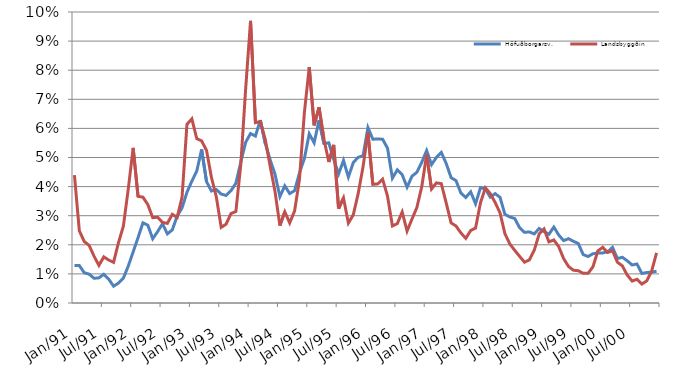
| Category | Höfuðborgarsv. | Landsbyggðin |
|---|---|---|
| 1991-01-01 | 1.291 | 4.392 |
| 1991-02-01 | 1.287 | 2.476 |
| 1991-03-01 | 1.041 | 2.116 |
| 1991-04-01 | 0.991 | 1.979 |
| 1991-05-01 | 0.85 | 1.608 |
| 1991-06-01 | 0.864 | 1.295 |
| 1991-07-01 | 0.989 | 1.583 |
| 1991-08-01 | 0.82 | 1.476 |
| 1991-09-01 | 0.577 | 1.394 |
| 1991-10-01 | 0.683 | 2.071 |
| 1991-11-01 | 0.855 | 2.641 |
| 1991-12-01 | 1.266 | 3.913 |
| 1992-01-01 | 1.756 | 5.33 |
| 1992-02-01 | 2.245 | 3.666 |
| 1992-03-01 | 2.755 | 3.638 |
| 1992-04-01 | 2.675 | 3.384 |
| 1992-05-01 | 2.208 | 2.933 |
| 1992-06-01 | 2.452 | 2.948 |
| 1992-07-01 | 2.724 | 2.768 |
| 1992-08-01 | 2.375 | 2.737 |
| 1992-09-01 | 2.512 | 3.047 |
| 1992-10-01 | 2.987 | 2.943 |
| 1992-11-01 | 3.271 | 3.641 |
| 1992-12-01 | 3.804 | 6.14 |
| 1993-01-01 | 4.187 | 6.329 |
| 1993-02-01 | 4.532 | 5.649 |
| 1993-03-01 | 5.278 | 5.572 |
| 1993-04-01 | 4.171 | 5.245 |
| 1993-05-01 | 3.849 | 4.319 |
| 1993-06-01 | 3.898 | 3.65 |
| 1993-07-01 | 3.743 | 2.599 |
| 1993-08-01 | 3.697 | 2.71 |
| 1993-09-01 | 3.86 | 3.074 |
| 1993-10-01 | 4.113 | 3.143 |
| 1993-11-01 | 4.836 | 4.743 |
| 1993-12-01 | 5.521 | 7.357 |
| 1994-01-01 | 5.823 | 9.697 |
| 1994-02-01 | 5.739 | 6.198 |
| 1994-03-01 | 6.284 | 6.237 |
| 1994-04-01 | 5.492 | 5.627 |
| 1994-05-01 | 4.928 | 4.708 |
| 1994-06-01 | 4.426 | 3.829 |
| 1994-07-01 | 3.657 | 2.659 |
| 1994-08-01 | 4.025 | 3.136 |
| 1994-09-01 | 3.762 | 2.751 |
| 1994-10-01 | 3.859 | 3.158 |
| 1994-11-01 | 4.467 | 4.248 |
| 1994-12-01 | 4.965 | 6.537 |
| 1995-01-01 | 5.814 | 8.106 |
| 1995-02-01 | 5.506 | 6.106 |
| 1995-03-01 | 6.281 | 6.725 |
| 1995-04-01 | 5.483 | 5.638 |
| 1995-05-01 | 5.504 | 4.843 |
| 1995-06-01 | 4.939 | 5.433 |
| 1995-07-01 | 4.434 | 3.24 |
| 1995-08-01 | 4.899 | 3.609 |
| 1995-09-01 | 4.327 | 2.746 |
| 1995-10-01 | 4.827 | 3.03 |
| 1995-11-01 | 5.007 | 3.757 |
| 1995-12-01 | 5.059 | 4.678 |
| 1996-01-01 | 6.027 | 5.854 |
| 1996-02-01 | 5.628 | 4.077 |
| 1996-03-01 | 5.638 | 4.093 |
| 1996-04-01 | 5.627 | 4.254 |
| 1996-05-01 | 5.321 | 3.672 |
| 1996-06-01 | 4.289 | 2.647 |
| 1996-07-01 | 4.574 | 2.727 |
| 1996-08-01 | 4.406 | 3.127 |
| 1996-09-01 | 3.981 | 2.471 |
| 1996-10-01 | 4.357 | 2.884 |
| 1996-11-01 | 4.491 | 3.281 |
| 1996-12-01 | 4.835 | 3.993 |
| 1997-01-01 | 5.237 | 5.101 |
| 1997-02-01 | 4.756 | 3.918 |
| 1997-03-01 | 5.003 | 4.129 |
| 1997-04-01 | 5.174 | 4.1 |
| 1997-05-01 | 4.793 | 3.436 |
| 1997-06-01 | 4.306 | 2.754 |
| 1997-07-01 | 4.206 | 2.646 |
| 1997-08-01 | 3.78 | 2.409 |
| 1997-09-01 | 3.626 | 2.221 |
| 1997-10-01 | 3.82 | 2.49 |
| 1997-11-01 | 3.41 | 2.575 |
| 1997-12-01 | 3.961 | 3.44 |
| 1998-01-01 | 3.918 | 3.957 |
| 1998-02-01 | 3.639 | 3.763 |
| 1998-03-01 | 3.759 | 3.455 |
| 1998-04-01 | 3.631 | 3.098 |
| 1998-05-01 | 3.048 | 2.382 |
| 1998-06-01 | 2.957 | 2.03 |
| 1998-07-01 | 2.905 | 1.811 |
| 1998-08-01 | 2.589 | 1.604 |
| 1998-09-01 | 2.428 | 1.403 |
| 1998-10-01 | 2.443 | 1.479 |
| 1998-11-01 | 2.374 | 1.815 |
| 1998-12-01 | 2.561 | 2.372 |
| 1999-01-01 | 2.457 | 2.545 |
| 1999-02-01 | 2.362 | 2.101 |
| 1999-03-01 | 2.61 | 2.166 |
| 1999-04-01 | 2.336 | 1.936 |
| 1999-05-01 | 2.143 | 1.526 |
| 1999-06-01 | 2.21 | 1.256 |
| 1999-07-01 | 2.121 | 1.126 |
| 1999-08-01 | 2.044 | 1.11 |
| 1999-09-01 | 1.664 | 1.022 |
| 1999-10-01 | 1.597 | 1.021 |
| 1999-11-01 | 1.693 | 1.244 |
| 1999-12-01 | 1.721 | 1.79 |
| 2000-01-01 | 1.722 | 1.913 |
| 2000-02-01 | 1.757 | 1.739 |
| 2000-03-01 | 1.912 | 1.793 |
| 2000-04-01 | 1.528 | 1.402 |
| 2000-05-01 | 1.572 | 1.277 |
| 2000-06-01 | 1.451 | 0.962 |
| 2000-07-01 | 1.308 | 0.753 |
| 2000-08-01 | 1.339 | 0.813 |
| 2000-09-01 | 1.014 | 0.651 |
| 2000-10-01 | 1.047 | 0.761 |
| 2000-11-01 | 1.061 | 1.096 |
| 2000-12-01 | 1.091 | 1.723 |